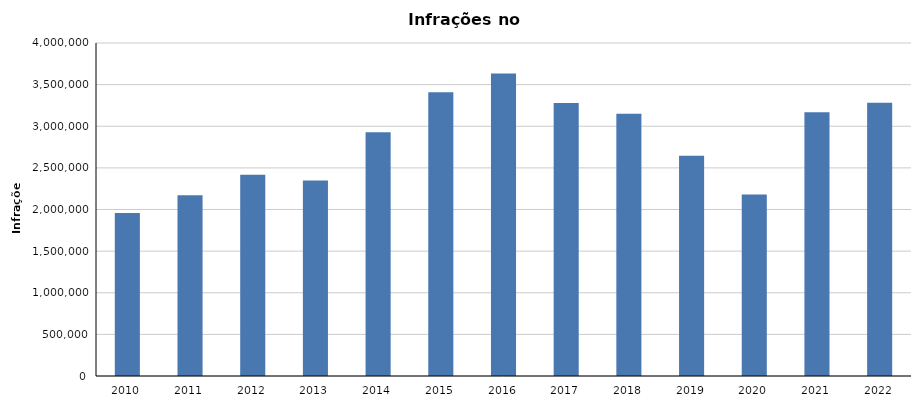
| Category | Infrações |
|---|---|
| 2010 | 1959096 |
| 2011 | 2172018 |
| 2012 | 2416836 |
| 2013 | 2347586 |
| 2014 | 2928315 |
| 2015 | 3409351 |
| 2016 | 3632325 |
| 2017 | 3278271 |
| 2018 | 3150474 |
| 2019 | 2644649 |
| 2020 | 2179035 |
| 2021 | 3167480 |
| 2022 | 3283726 |